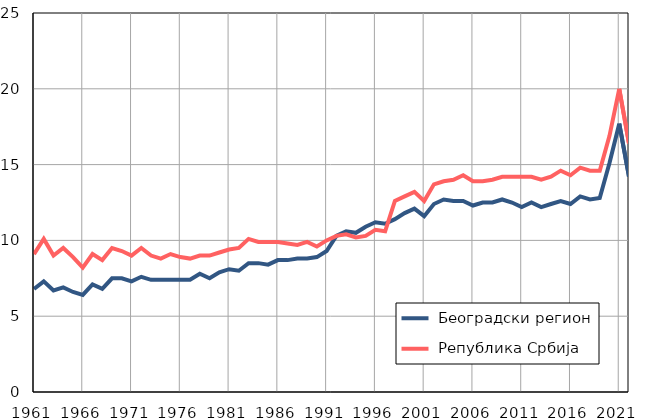
| Category |  Београдски регион |  Република Србија |
|---|---|---|
| 1961.0 | 6.8 | 9.1 |
| 1962.0 | 7.3 | 10.1 |
| 1963.0 | 6.7 | 9 |
| 1964.0 | 6.9 | 9.5 |
| 1965.0 | 6.6 | 8.9 |
| 1966.0 | 6.4 | 8.2 |
| 1967.0 | 7.1 | 9.1 |
| 1968.0 | 6.8 | 8.7 |
| 1969.0 | 7.5 | 9.5 |
| 1970.0 | 7.5 | 9.3 |
| 1971.0 | 7.3 | 9 |
| 1972.0 | 7.6 | 9.5 |
| 1973.0 | 7.4 | 9 |
| 1974.0 | 7.4 | 8.8 |
| 1975.0 | 7.4 | 9.1 |
| 1976.0 | 7.4 | 8.9 |
| 1977.0 | 7.4 | 8.8 |
| 1978.0 | 7.8 | 9 |
| 1979.0 | 7.5 | 9 |
| 1980.0 | 7.9 | 9.2 |
| 1981.0 | 8.1 | 9.4 |
| 1982.0 | 8 | 9.5 |
| 1983.0 | 8.5 | 10.1 |
| 1984.0 | 8.5 | 9.9 |
| 1985.0 | 8.4 | 9.9 |
| 1986.0 | 8.7 | 9.9 |
| 1987.0 | 8.7 | 9.8 |
| 1988.0 | 8.8 | 9.7 |
| 1989.0 | 8.8 | 9.9 |
| 1990.0 | 8.9 | 9.6 |
| 1991.0 | 9.3 | 10 |
| 1992.0 | 10.3 | 10.3 |
| 1993.0 | 10.6 | 10.4 |
| 1994.0 | 10.5 | 10.2 |
| 1995.0 | 10.9 | 10.3 |
| 1996.0 | 11.2 | 10.7 |
| 1997.0 | 11.1 | 10.6 |
| 1998.0 | 11.4 | 12.6 |
| 1999.0 | 11.8 | 12.9 |
| 2000.0 | 12.1 | 13.2 |
| 2001.0 | 11.6 | 12.6 |
| 2002.0 | 12.4 | 13.7 |
| 2003.0 | 12.7 | 13.9 |
| 2004.0 | 12.6 | 14 |
| 2005.0 | 12.6 | 14.3 |
| 2006.0 | 12.3 | 13.9 |
| 2007.0 | 12.5 | 13.9 |
| 2008.0 | 12.5 | 14 |
| 2009.0 | 12.7 | 14.2 |
| 2010.0 | 12.5 | 14.2 |
| 2011.0 | 12.2 | 14.2 |
| 2012.0 | 12.5 | 14.2 |
| 2013.0 | 12.2 | 14 |
| 2014.0 | 12.4 | 14.2 |
| 2015.0 | 12.6 | 14.6 |
| 2016.0 | 12.4 | 14.3 |
| 2017.0 | 12.9 | 14.8 |
| 2018.0 | 12.7 | 14.6 |
| 2019.0 | 12.8 | 14.6 |
| 2020.0 | 15.1 | 16.9 |
| 2021.0 | 17.7 | 20 |
| 2022.0 | 14.2 | 16.4 |